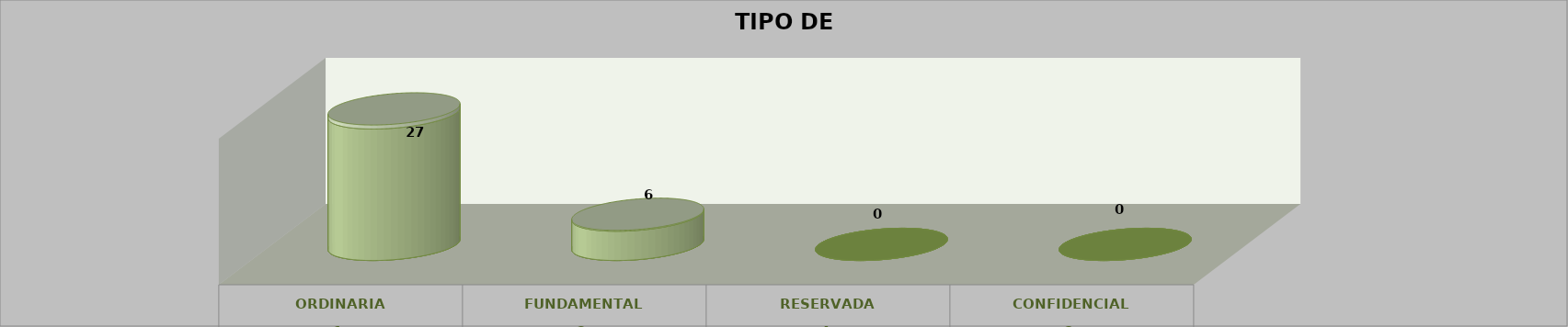
| Category | Series 0 | Series 2 | Series 1 | Series 3 | Series 4 |
|---|---|---|---|---|---|
| 0 |  |  |  | 27 | 0.818 |
| 1 |  |  |  | 6 | 0.182 |
| 2 |  |  |  | 0 | 0 |
| 3 |  |  |  | 0 | 0 |